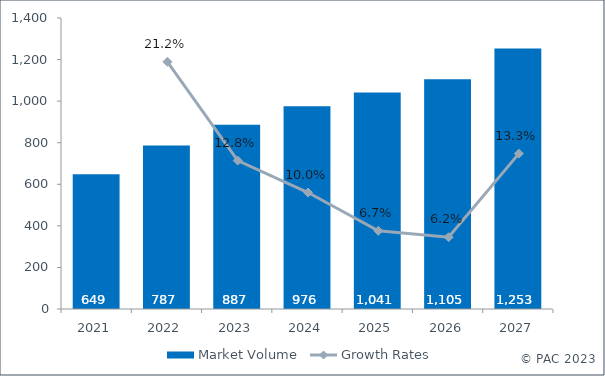
| Category | Market Volume |
|---|---|
| 2021.0 | 648.806 |
| 2022.0 | 786.59 |
| 2023.0 | 886.903 |
| 2024.0 | 975.65 |
| 2025.0 | 1041.16 |
| 2026.0 | 1105.366 |
| 2027.0 | 1252.918 |